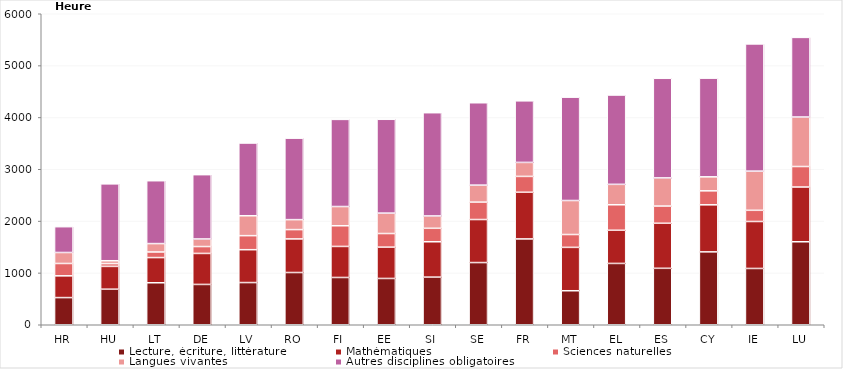
| Category | Lecture, écriture, littérature  | Mathématiques | Sciences naturelles | Langues vivantes  | Autres disciplines obligatoires |
|---|---|---|---|---|---|
| HR | 524 | 420 | 238 | 212 | 498 |
| HU | 686 | 440 | 54 | 55 | 1483 |
| LT | 810 | 486 | 108 | 162 | 1213 |
| DE | 778 | 598 | 133 | 146 | 1241 |
| LV | 814 | 634 | 271 | 384 | 1403 |
| RO | 1008 | 648 | 180 | 192 | 1572 |
| FI | 912 | 599 | 399 | 371 | 1681 |
| EE | 893 | 604 | 263 | 394 | 1810 |
| SI | 919 | 682 | 260 | 238 | 1992 |
| SE | 1200 | 830 | 336 | 328 | 1589 |
| FR | 1656 | 900 | 306 | 270 | 1188 |
| MT | 656 | 837 | 248 | 656 | 1994 |
| EL | 1183 | 640 | 492 | 394 | 1723 |
| ES | 1089 | 869 | 332 | 543 | 1922 |
| CY | 1406 | 908 | 270 | 270 | 1904 |
| IE | 1086 | 906 | 216 | 756 | 2454 |
| LU | 1601 | 1056 | 396 | 955 | 1536 |